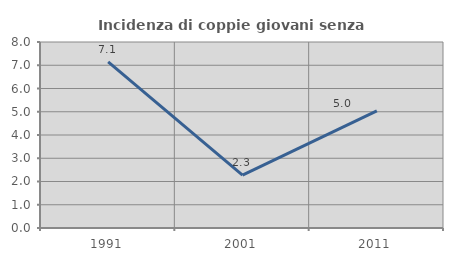
| Category | Incidenza di coppie giovani senza figli |
|---|---|
| 1991.0 | 7.143 |
| 2001.0 | 2.273 |
| 2011.0 | 5.036 |